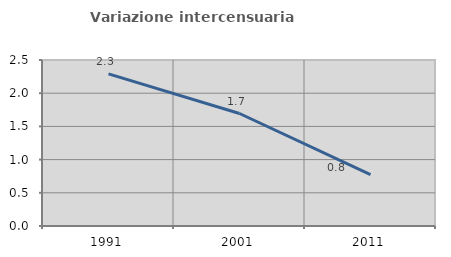
| Category | Variazione intercensuaria annua |
|---|---|
| 1991.0 | 2.291 |
| 2001.0 | 1.694 |
| 2011.0 | 0.773 |